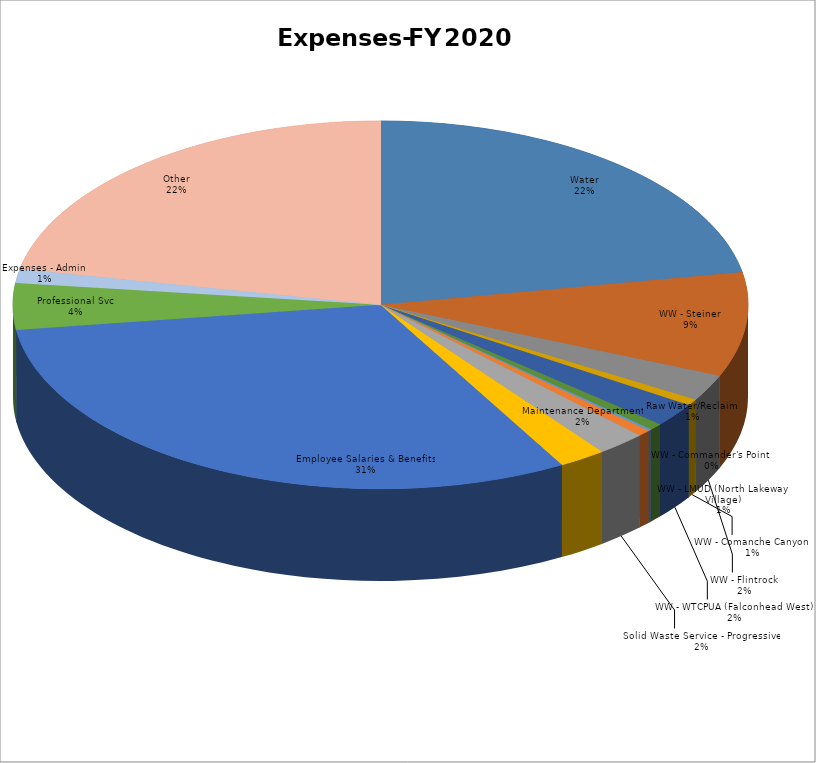
| Category | Series 0 | Series 1 |
|---|---|---|
| Water | 4357800 | 0.222 |
| WW - Steiner | 1801500 | 0.092 |
| WW - Flintrock | 452000 | 0.023 |
| WW - Comanche Canyon | 112300 | 0.006 |
| WW - WTCPUA (Falconhead West) | 407600 | 0.021 |
| WW - LMUD (North Lakeway Village) | 116800 | 0.006 |
| WW - Commander's Point | 29200 | 0.001 |
| Raw Water/Reclaim | 110000 | 0.006 |
| Solid Waste Service - Progressive | 425000 | 0.022 |
| Maintenance Department | 409000 | 0.021 |
| Employee Salaries & Benefits | 6102118 | 0.31 |
| Professional Svc | 805000 | 0.041 |
| Expenses - Admin | 240684 | 0.012 |
| Other | 4302701 | 0.219 |